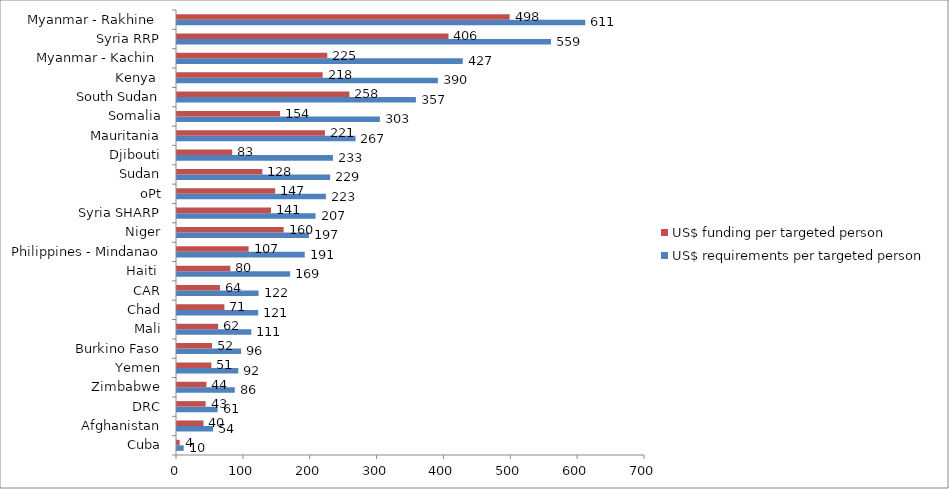
| Category | US$ requirements per targeted person | US$ funding per targeted person |
|---|---|---|
| Cuba | 10 | 4.031 |
| Afghanistan | 53.912 | 39.597 |
| DRC | 60.724 | 42.815 |
| Zimbabwe | 86.454 | 44.021 |
| Yemen | 91.658 | 51.408 |
| Burkino Faso | 95.884 | 52.343 |
| Mali | 111.172 | 61.561 |
| Chad | 121.414 | 70.919 |
| CAR | 121.96 | 64.251 |
| Haiti  | 169.271 | 79.796 |
| Philippines - Mindanao | 191.018 | 107.09 |
| Niger | 197.377 | 159.519 |
| Syria SHARP | 207.325 | 140.584 |
| oPt | 222.689 | 146.902 |
| Sudan | 229.098 | 127.685 |
| Djibouti | 233.277 | 82.512 |
| Mauritania | 266.983 | 221.28 |
| Somalia | 303.444 | 154.141 |
| South Sudan | 357.346 | 257.915 |
| Kenya  | 390.183 | 217.914 |
| Myanmar - Kachin  | 427.475 | 224.816 |
| Syria RRP | 559.407 | 406.055 |
| Myanmar - Rakhine  | 610.666 | 497.517 |